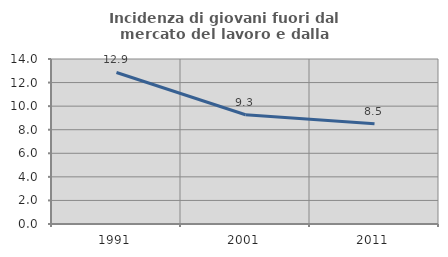
| Category | Incidenza di giovani fuori dal mercato del lavoro e dalla formazione  |
|---|---|
| 1991.0 | 12.857 |
| 2001.0 | 9.272 |
| 2011.0 | 8.497 |